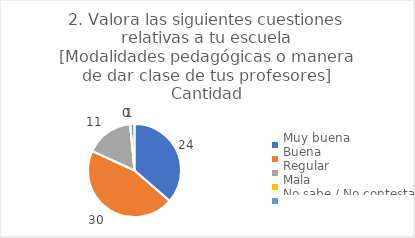
| Category | 2. Valora las siguientes cuestiones relativas a tu escuela
[Modalidades pedagógicas o manera de dar clase de tus profesores] |
|---|---|
| Muy buena  | 0.364 |
| Buena  | 0.455 |
| Regular  | 0.167 |
| Mala  | 0 |
| No sabe / No contesta | 0.015 |